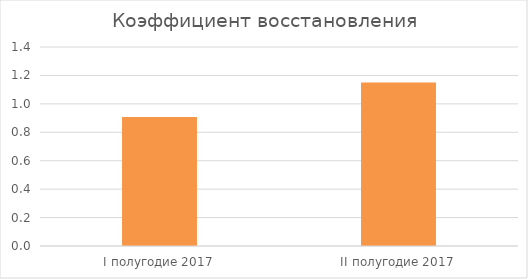
| Category | Коэффициент восстановления платежеспособности |
|---|---|
| I полугодие 2017 | 0.908 |
| II полугодие 2017 | 1.15 |